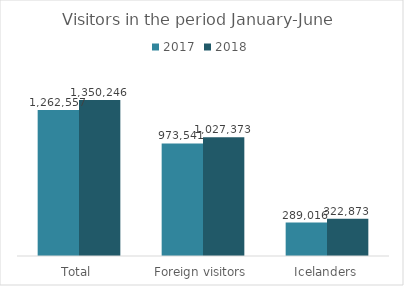
| Category | 2017 | 2018 |
|---|---|---|
| Total | 1262557 | 1350246 |
| Foreign visitors | 973541 | 1027373 |
| Icelanders | 289016 | 322873 |